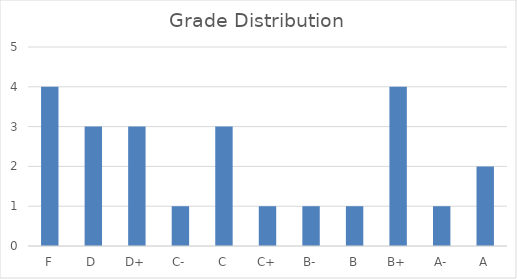
| Category | Series 0 |
|---|---|
| F | 4 |
| D | 3 |
| D+ | 3 |
| C- | 1 |
| C | 3 |
| C+ | 1 |
| B- | 1 |
| B | 1 |
| B+ | 4 |
| A- | 1 |
| A | 2 |